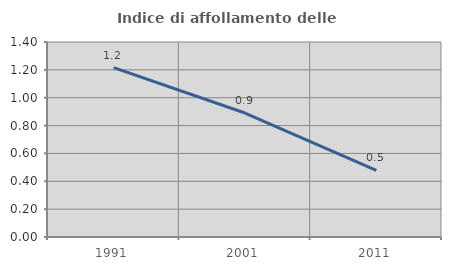
| Category | Indice di affollamento delle abitazioni  |
|---|---|
| 1991.0 | 1.216 |
| 2001.0 | 0.89 |
| 2011.0 | 0.479 |